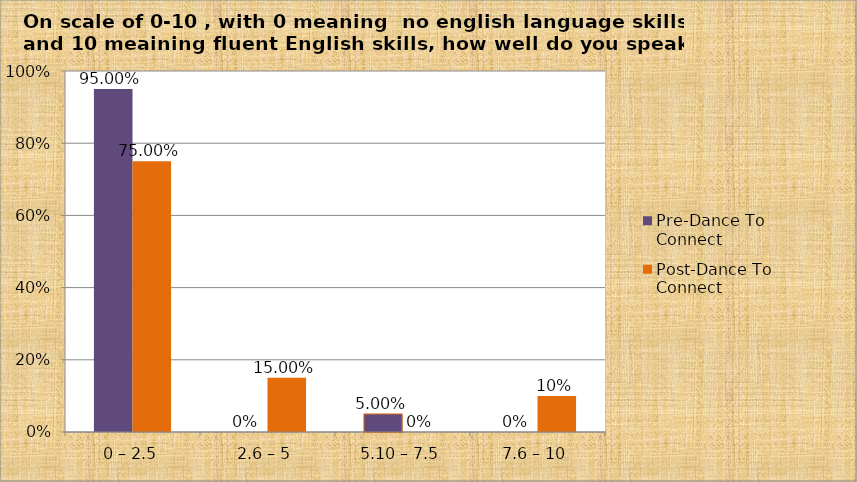
| Category | Pre-Dance To Connect | Post-Dance To Connect |
|---|---|---|
| 0 – 2.5 | 0.95 | 0.75 |
| 2.6 – 5 | 0 | 0.15 |
| 5.10 – 7.5 | 0.05 | 0 |
| 7.6 – 10 | 0 | 0.1 |